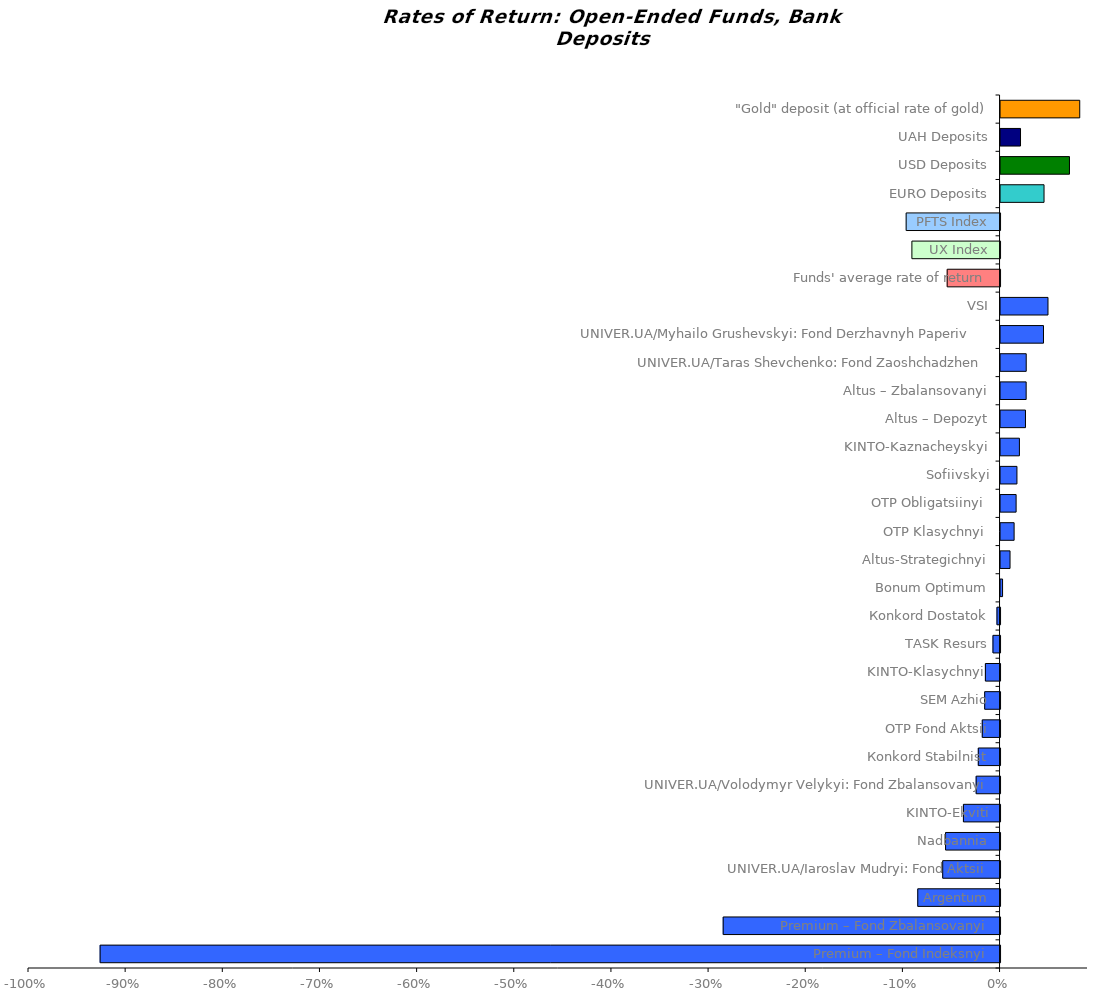
| Category | Series 0 |
|---|---|
| Premium – Fond Indeksnyi | -0.926 |
| Premium – Fond Zbalansovanyi | -0.285 |
| Argentum | -0.085 |
| UNIVER.UA/Iaroslav Mudryi: Fond Aktsii | -0.059 |
| Nadbannia | -0.056 |
| KINTO-Ekviti | -0.038 |
| UNIVER.UA/Volodymyr Velykyi: Fond Zbalansovanyi | -0.025 |
| Кonkord Stabilnist | -0.022 |
| OTP Fond Aktsii | -0.018 |
| SEM Azhio | -0.016 |
| KINTO-Klasychnyi  | -0.015 |
| TASK Resurs | -0.007 |
| Коnkord Dostatok | -0.003 |
| Bonum Optimum | 0.002 |
| Altus-Strategichnyi | 0.01 |
| OTP Klasychnyi  | 0.014 |
| OTP Obligatsiinyi  | 0.016 |
| Sofiivskyi | 0.017 |
| KINTO-Kaznacheyskyi | 0.019 |
| Altus – Depozyt | 0.026 |
| Altus – Zbalansovanyi | 0.026 |
| UNIVER.UA/Taras Shevchenko: Fond Zaoshchadzhen | 0.026 |
| UNIVER.UA/Myhailo Grushevskyi: Fond Derzhavnyh Paperiv    | 0.044 |
| VSI | 0.049 |
| Funds' average rate of return | -0.054 |
| UX Index | -0.091 |
| PFTS Index | -0.097 |
| EURO Deposits | 0.045 |
| USD Deposits | 0.071 |
| UAH Deposits | 0.021 |
| "Gold" deposit (at official rate of gold) | 0.081 |